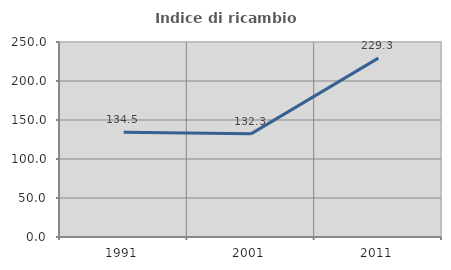
| Category | Indice di ricambio occupazionale  |
|---|---|
| 1991.0 | 134.454 |
| 2001.0 | 132.258 |
| 2011.0 | 229.293 |